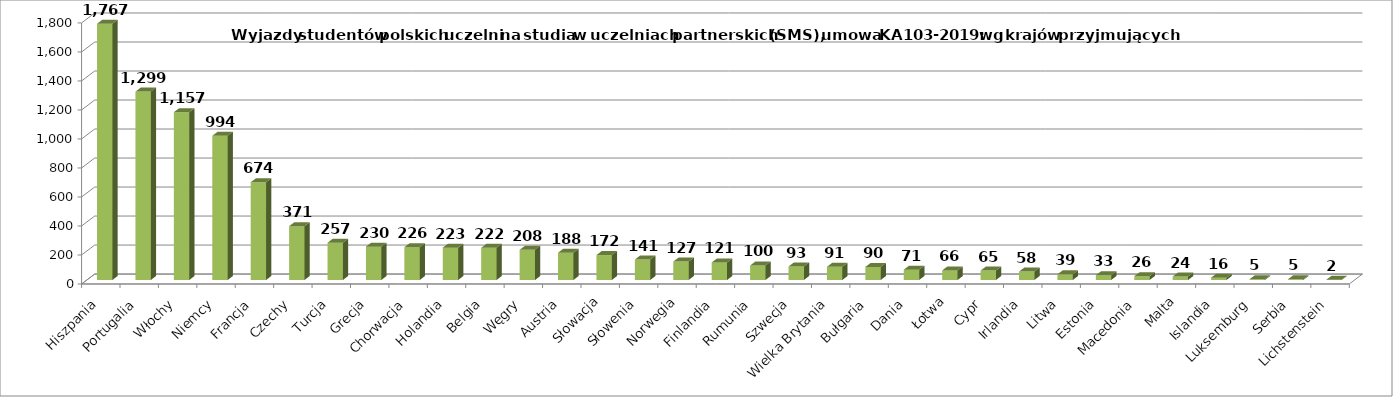
| Category | Series 0 |
|---|---|
| Hiszpania | 1767 |
| Portugalia | 1299 |
| Włochy | 1157 |
| Niemcy | 994 |
| Francja  | 674 |
| Czechy | 371 |
| Turcja | 257 |
| Grecja | 230 |
| Chorwacja | 226 |
| Holandia | 223 |
| Belgia | 222 |
| Węgry | 208 |
| Austria | 188 |
| Słowacja | 172 |
| Słowenia | 141 |
| Norwegia | 127 |
| Finlandia | 121 |
| Rumunia | 100 |
| Szwecja | 93 |
| Wielka Brytania | 91 |
| Bułgaria | 90 |
| Dania | 71 |
| Łotwa | 66 |
| Cypr | 65 |
| Irlandia | 58 |
| Litwa | 39 |
| Estonia | 33 |
| Macedonia | 26 |
| Malta | 24 |
| Islandia | 16 |
| Luksemburg | 5 |
| Serbia | 5 |
| Lichstenstein | 2 |